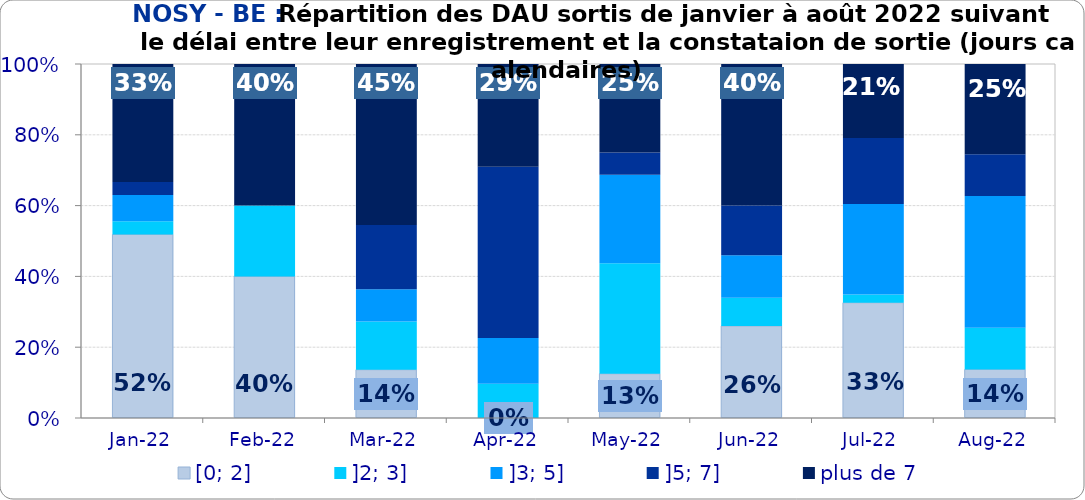
| Category | [0; 2] | ]2; 3] | ]3; 5] | ]5; 7] | plus de 7 |
|---|---|---|---|---|---|
| 2022-01-01 | 0.519 | 0.037 | 0.074 | 0.037 | 0.333 |
| 2022-02-01 | 0.4 | 0.2 | 0 | 0 | 0.4 |
| 2022-03-01 | 0.136 | 0.136 | 0.091 | 0.182 | 0.455 |
| 2022-04-01 | 0 | 0.097 | 0.129 | 0.484 | 0.29 |
| 2022-05-01 | 0.125 | 0.312 | 0.25 | 0.062 | 0.25 |
| 2022-06-01 | 0.26 | 0.08 | 0.12 | 0.14 | 0.4 |
| 2022-07-01 | 0.326 | 0.023 | 0.256 | 0.186 | 0.209 |
| 2022-08-01 | 0.137 | 0.118 | 0.373 | 0.118 | 0.255 |